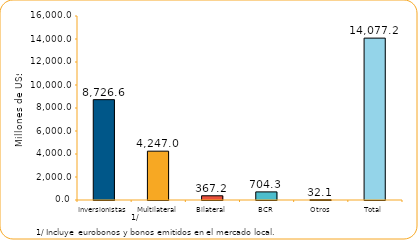
| Category | Series 1 |
|---|---|
| Inversionistas | 8726.6 |
| Multilateral | 4247 |
| Bilateral | 367.2 |
| BCR | 704.3 |
| Otros | 32.1 |
| Total | 14077.2 |